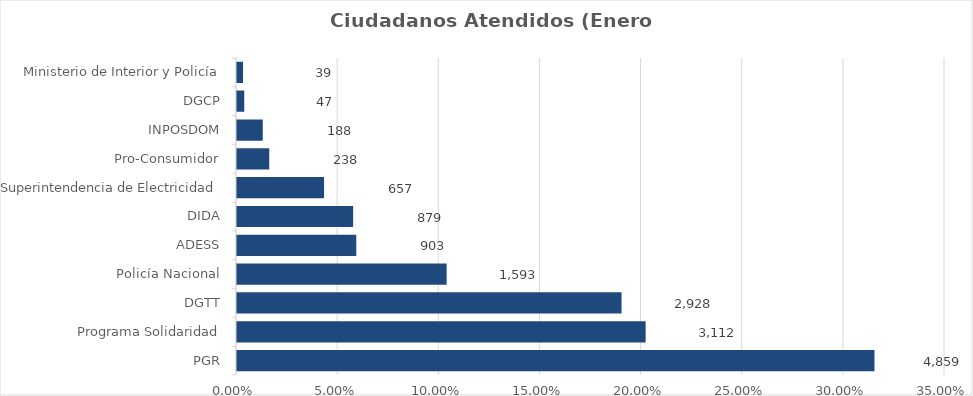
| Category | Porcentaje |
|---|---|
| PGR | 0.315 |
| Programa Solidaridad | 0.202 |
| DGTT | 0.19 |
| Policía Nacional | 0.103 |
| ADESS | 0.058 |
| DIDA | 0.057 |
| Superintendencia de Electricidad | 0.043 |
| Pro-Consumidor | 0.015 |
| INPOSDOM | 0.012 |
| DGCP | 0.003 |
| Ministerio de Interior y Policía | 0.003 |